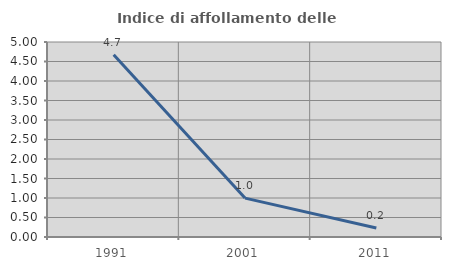
| Category | Indice di affollamento delle abitazioni  |
|---|---|
| 1991.0 | 4.67 |
| 2001.0 | 0.998 |
| 2011.0 | 0.231 |